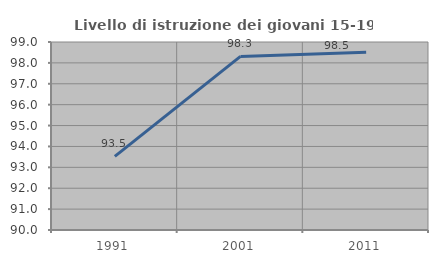
| Category | Livello di istruzione dei giovani 15-19 anni |
|---|---|
| 1991.0 | 93.524 |
| 2001.0 | 98.309 |
| 2011.0 | 98.507 |